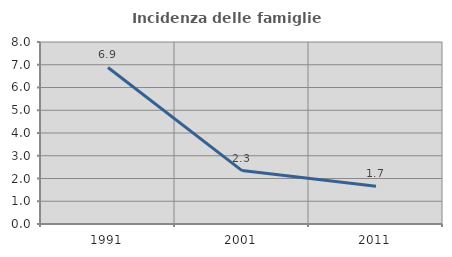
| Category | Incidenza delle famiglie numerose |
|---|---|
| 1991.0 | 6.881 |
| 2001.0 | 2.347 |
| 2011.0 | 1.662 |